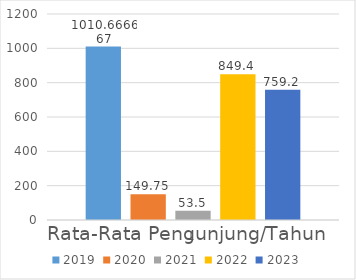
| Category | 2019 | 2020 | 2021 | 2022 | 2023 |
|---|---|---|---|---|---|
| 0 | 1010.667 | 149.75 | 53.5 | 849.4 | 759.2 |